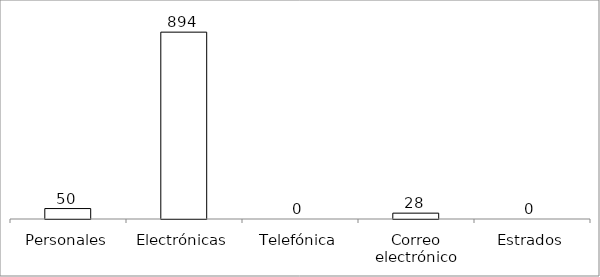
| Category | Series 0 |
|---|---|
| Personales | 50 |
| Electrónicas | 894 |
| Telefónica | 0 |
| Correo electrónico | 28 |
| Estrados | 0 |